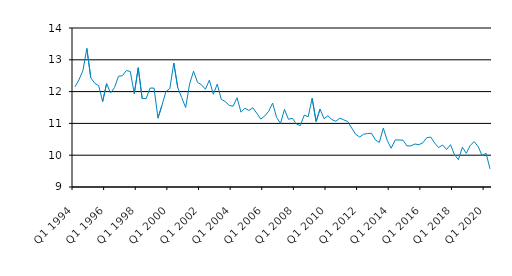
| Category | Series 0 |
|---|---|
| Q1 1994 | 12.15 |
| Q2 1994 | 12.369 |
| Q3 1994 | 12.659 |
| Q4 1994 | 13.357 |
| Q1 1995 | 12.435 |
| Q2 1995 | 12.262 |
| Q3 1995 | 12.188 |
| Q4 1995 | 11.688 |
| Q1 1996 | 12.25 |
| Q2 1996 | 11.958 |
| Q3 1996 | 12.125 |
| Q4 1996 | 12.483 |
| Q1 1997 | 12.5 |
| Q2 1997 | 12.662 |
| Q3 1997 | 12.633 |
| Q4 1997 | 11.933 |
| Q1 1998 | 12.75 |
| Q2 1998 | 11.781 |
| Q3 1998 | 11.781 |
| Q4 1998 | 12.11 |
| Q1 1999 | 12.11 |
| Q2 1999 | 11.166 |
| Q3 1999 | 11.566 |
| Q4 1999 | 12 |
| Q1 2000 | 12.1 |
| Q2 2000 | 12.899 |
| Q3 2000 | 12.125 |
| Q4 2000 | 11.812 |
| Q1 2001 | 11.5 |
| Q2 2001 | 12.241 |
| Q3 2001 | 12.642 |
| Q4 2001 | 12.291 |
| Q1 2002 | 12.215 |
| Q2 2002 | 12.075 |
| Q3 2002 | 12.36 |
| Q4 2002 | 11.917 |
| Q1 2003 | 12.236 |
| Q2 2003 | 11.761 |
| Q3 2003 | 11.688 |
| Q4 2003 | 11.569 |
| Q1 2004 | 11.539 |
| Q2 2004 | 11.807 |
| Q3 2004 | 11.354 |
| Q4 2004 | 11.477 |
| Q1 2005 | 11.406 |
| Q2 2005 | 11.493 |
| Q3 2005 | 11.318 |
| Q4 2005 | 11.136 |
| Q1 2006 | 11.231 |
| Q2 2006 | 11.38 |
| Q3 2006 | 11.64 |
| Q4 2006 | 11.19 |
| Q1 2007 | 11 |
| Q2 2007 | 11.44 |
| Q3 2007 | 11.13 |
| Q4 2007 | 11.16 |
| Q1 2008 | 10.98 |
| Q2 2008 | 10.93 |
| Q3 2008 | 11.26 |
| Q4 2008 | 11.21 |
| Q1 2009 | 11.79 |
| Q2 2009 | 11.06 |
| Q3 2009 | 11.45 |
| Q4 2009 | 11.15 |
| Q1 2010 | 11.24 |
| Q2 2010 | 11.12 |
| Q3 2010 | 11.067 |
| Q4 2010 | 11.166 |
| Q1 2011 | 11.11 |
| Q2 2011 | 11.06 |
| Q3 2011 | 10.855 |
| Q4 2011 | 10.66 |
| Q1 2012 | 10.57 |
| Q2 2012 | 10.66 |
| Q3 2012 | 10.68 |
| Q4 2012 | 10.69 |
| Q1 2013 | 10.48 |
| Q2 2013 | 10.4 |
| Q3 2013 | 10.85 |
| Q4 2013 | 10.46 |
| Q1 2014 | 10.22 |
| Q2 2014 | 10.479 |
| Q3 2014 | 10.48 |
| Q4 2014 | 10.47 |
| Q1 2015 | 10.29 |
| Q2 2015 | 10.295 |
| Q3 2015 | 10.352 |
| Q4 2015 | 10.33 |
| Q1 2016 | 10.39 |
| Q2 2016 | 10.55 |
| Q3 2016 | 10.57 |
| Q4 2016 | 10.38 |
| Q1 2017 | 10.24 |
| Q2 2017 | 10.32 |
| Q3 2017 | 10.18 |
| Q4 2017 | 10.33 |
| Q1 2018 | 10.02 |
| Q2 2018 | 9.86 |
| Q3 2018 | 10.251 |
| Q4 2018 | 10.06 |
| Q1 2019 | 10.308 |
| Q2 2019 | 10.429 |
| Q3 2019 | 10.27 |
| Q4 2019* | 9.99 |
| Q1 2020 | 10.06 |
| Q2 2020 | 9.57 |